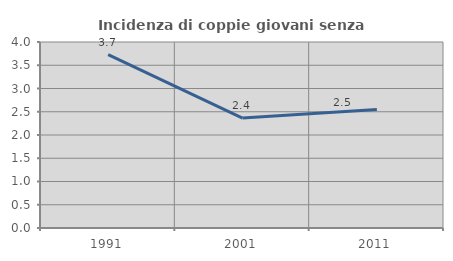
| Category | Incidenza di coppie giovani senza figli |
|---|---|
| 1991.0 | 3.729 |
| 2001.0 | 2.364 |
| 2011.0 | 2.549 |